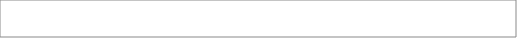
| Category | Series 0 |
|---|---|
| 6.73 | 1 |
| 6.33 | 1 |
| 6.99 | 1 |
| 6.26 | 1 |
| 6.89 | 1 |
| 7.09 | 1 |
| 6.71 | 1 |
| 6.41 | 1 |
| 7.05 | 1 |
| 6.71 | 1 |
| 6.7170000000000005 | 1 |